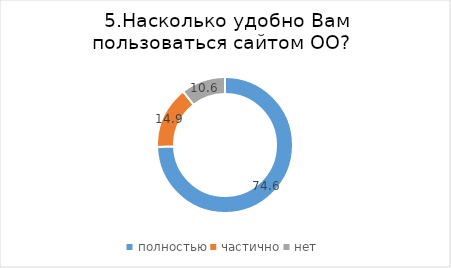
| Category | Series 0 |
|---|---|
| полностью | 74.573 |
| частично | 14.874 |
| нет | 10.553 |